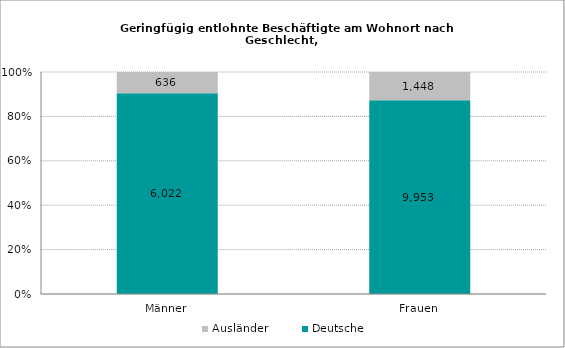
| Category | Deutsche | Ausländer |
|---|---|---|
| Männer | 6022 | 636 |
| Frauen | 9953 | 1448 |